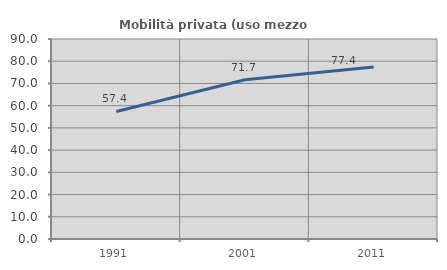
| Category | Mobilità privata (uso mezzo privato) |
|---|---|
| 1991.0 | 57.411 |
| 2001.0 | 71.687 |
| 2011.0 | 77.35 |